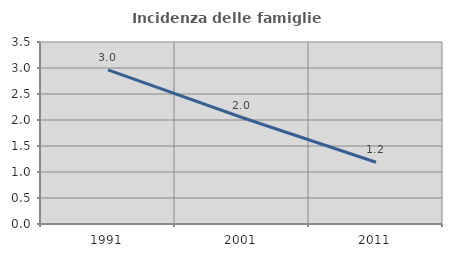
| Category | Incidenza delle famiglie numerose |
|---|---|
| 1991.0 | 2.963 |
| 2001.0 | 2.047 |
| 2011.0 | 1.188 |